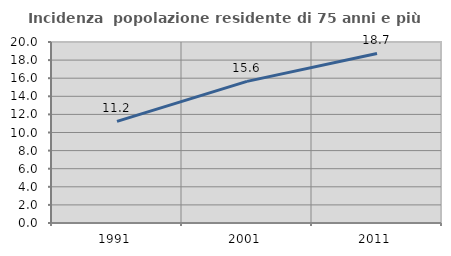
| Category | Incidenza  popolazione residente di 75 anni e più |
|---|---|
| 1991.0 | 11.233 |
| 2001.0 | 15.647 |
| 2011.0 | 18.734 |